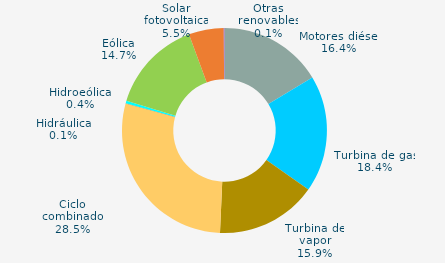
| Category | Series 0 |
|---|---|
| Motores diésel | 16.373 |
| Turbina de gas | 18.395 |
| Turbina de vapor | 15.935 |
| Ciclo combinado | 28.532 |
| Cogeneración | 0 |
| Hidráulica | 0.067 |
| Hidroeólica | 0.376 |
| Eólica | 14.683 |
| Solar fotovoltaica | 5.517 |
| Otras renovables | 0.122 |